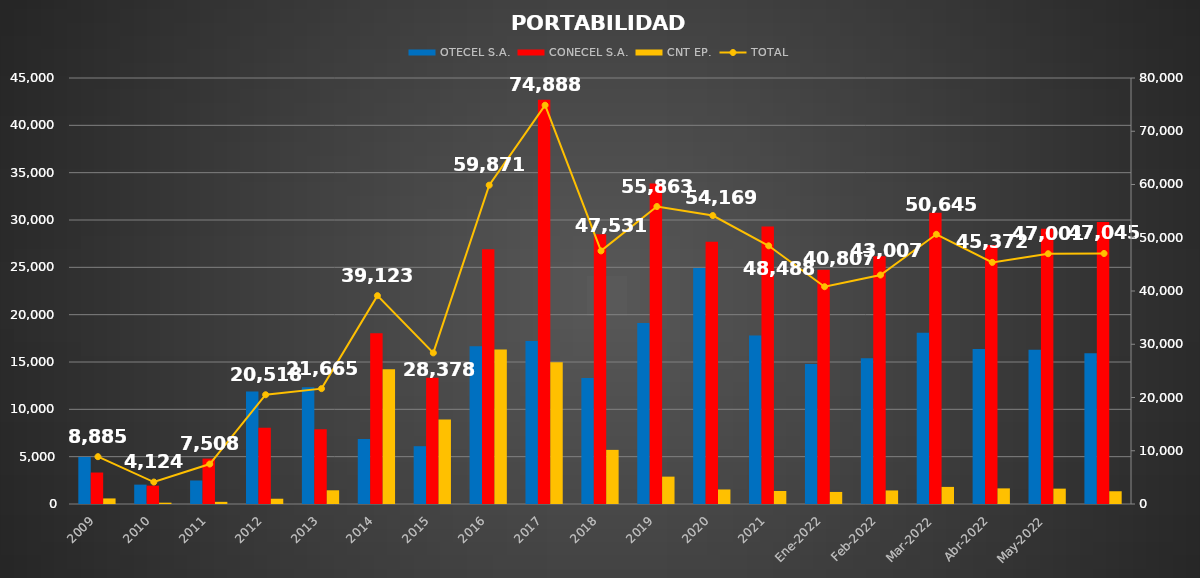
| Category | OTECEL S.A. | CONECEL S.A. | CNT EP. |
|---|---|---|---|
| 2009 | 4973 | 3324 | 588 |
| 2010 | 2045 | 1939 | 140 |
| 2011 | 2484 | 4796 | 228 |
| 2012 | 11894 | 8067 | 557 |
| 2013 | 12323 | 7893 | 1449 |
| 2014 | 6853 | 18039 | 14231 |
| 2015 | 6105 | 13334 | 8939 |
| 2016 | 16653 | 26907 | 16311 |
| 2017 | 17228 | 42694 | 14966 |
| 2018 | 13309 | 28504 | 5718 |
| 2019 | 19116 | 33857 | 2890 |
| 2020 | 24933 | 27700 | 1536 |
| 2021 | 17795 | 29321 | 1372 |
| Ene-2022 | 14781 | 24752 | 1274 |
| Feb-2022 | 15406 | 26168 | 1433 |
| Mar-2022 | 18084 | 30756 | 1805 |
| Abr-2022 | 16370 | 27352 | 1650 |
| May-2022 | 16305 | 29073 | 1623 |